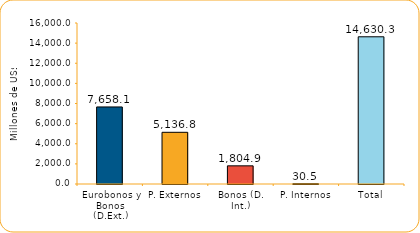
| Category | Series 1 |
|---|---|
| Eurobonos y Bonos (D.Ext.) | 7658.1 |
| P. Externos | 5136.8 |
| Bonos (D. Int.) | 1804.9 |
| P. Internos | 30.5 |
| Total | 14630.3 |